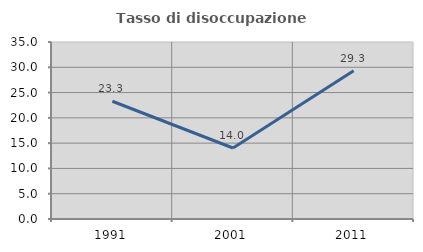
| Category | Tasso di disoccupazione giovanile  |
|---|---|
| 1991.0 | 23.288 |
| 2001.0 | 14.035 |
| 2011.0 | 29.31 |